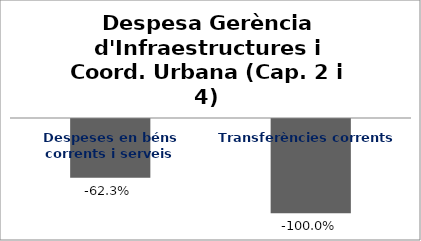
| Category | Series 0 |
|---|---|
| Despeses en béns corrents i serveis | -0.623 |
| Transferències corrents | -1 |